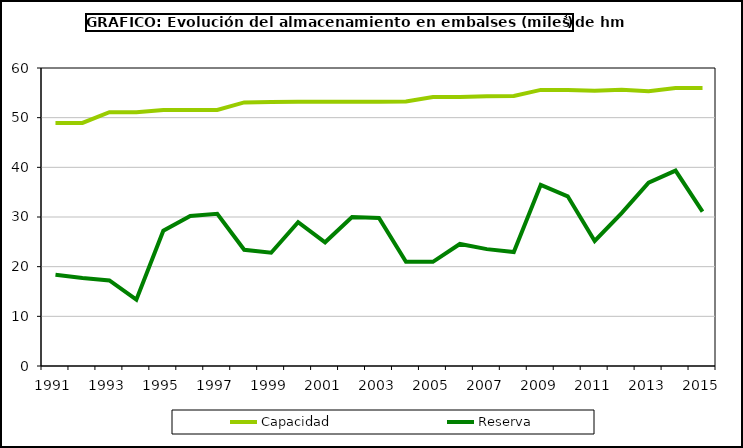
| Category | Capacidad | Reserva |
|---|---|---|
| 1991.0 | 48.95 | 18.37 |
| 1992.0 | 48.95 | 17.71 |
| 1993.0 | 51.11 | 17.23 |
| 1994.0 | 51.1 | 13.35 |
| 1995.0 | 51.56 | 27.23 |
| 1996.0 | 51.56 | 30.19 |
| 1997.0 | 51.56 | 30.64 |
| 1998.0 | 53.07 | 23.4 |
| 1999.0 | 53.17 | 22.81 |
| 2000.0 | 53.19 | 28.97 |
| 2001.0 | 53.22 | 24.9 |
| 2002.0 | 53.19 | 29.98 |
| 2003.0 | 53.2 | 29.8 |
| 2004.0 | 53.25 | 20.97 |
| 2005.0 | 54.15 | 20.98 |
| 2006.0 | 54.15 | 24.57 |
| 2007.0 | 54.31 | 23.53 |
| 2008.0 | 54.38 | 22.95 |
| 2009.0 | 55.59 | 36.47 |
| 2010.0 | 55.59 | 34.17 |
| 2011.0 | 55.4 | 25.18 |
| 2012.0 | 55.6 | 30.8 |
| 2013.0 | 55.3 | 36.9 |
| 2014.0 | 55.977 | 39.35 |
| 2015.0 | 55.977 | 31.1 |